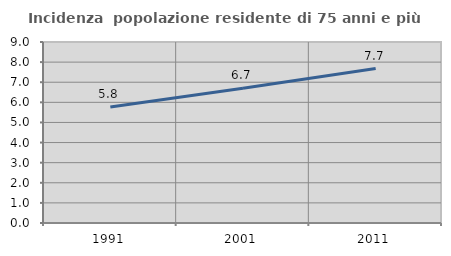
| Category | Incidenza  popolazione residente di 75 anni e più |
|---|---|
| 1991.0 | 5.763 |
| 2001.0 | 6.705 |
| 2011.0 | 7.68 |